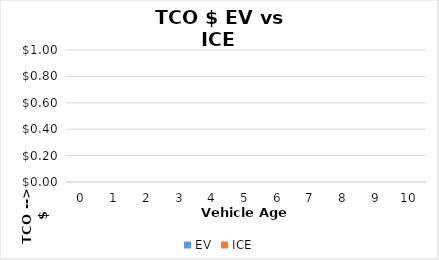
| Category | EV | ICE |
|---|---|---|
| 0.0 | 0 | 0 |
| 1.0 | 0 | 0 |
| 2.0 | 0 | 0 |
| 3.0 | 0 | 0 |
| 4.0 | 0 | 0 |
| 5.0 | 0 | 0 |
| 6.0 | 0 | 0 |
| 7.0 | 0 | 0 |
| 8.0 | 0 | 0 |
| 9.0 | 0 | 0 |
| 10.0 | 0 | 0 |